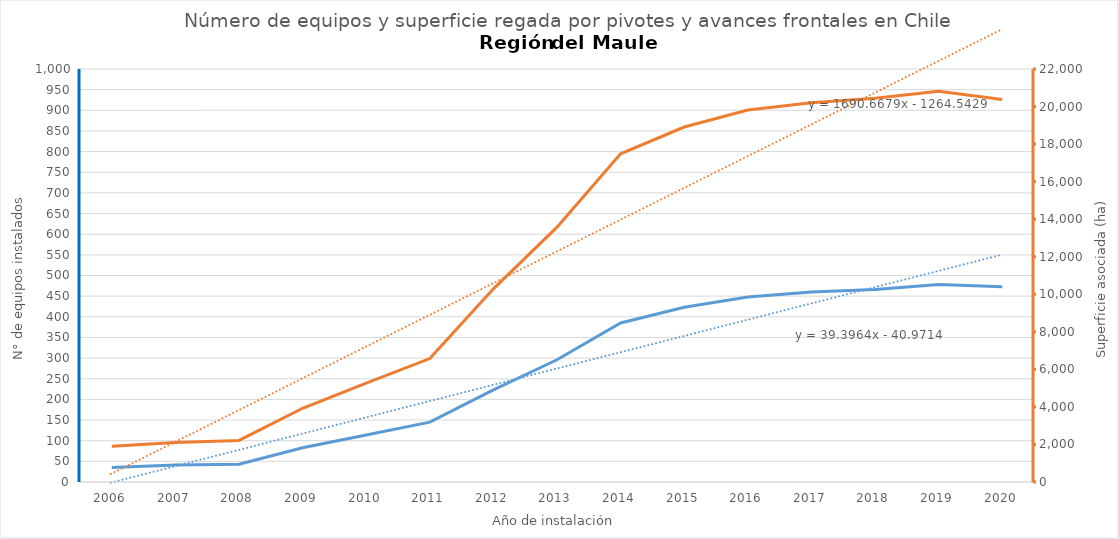
| Category | N° |
|---|---|
| 2006.0 | 35 |
| 2007.0 | 41 |
| 2008.0 | 43 |
| 2009.0 | 83 |
| 2010.0 | 114 |
| 2011.0 | 145 |
| 2012.0 | 223 |
| 2013.0 | 296 |
| 2014.0 | 385 |
| 2015.0 | 423 |
| 2016.0 | 448 |
| 2017.0 | 460 |
| 2018.0 | 466 |
| 2019.0 | 478 |
| 2020.0 | 473 |